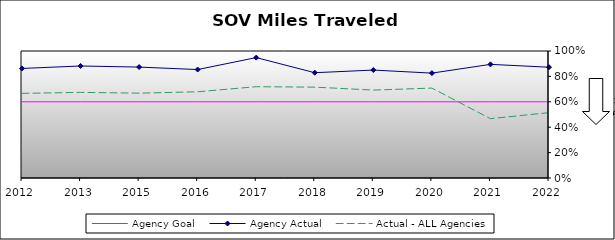
| Category | Agency Goal | Agency Actual | Actual - ALL Agencies |
|---|---|---|---|
| 2012.0 | 0.6 | 0.863 | 0.666 |
| 2013.0 | 0.6 | 0.882 | 0.674 |
| 2015.0 | 0.6 | 0.873 | 0.668 |
| 2016.0 | 0.6 | 0.854 | 0.679 |
| 2017.0 | 0.6 | 0.948 | 0.719 |
| 2018.0 | 0.6 | 0.829 | 0.715 |
| 2019.0 | 0.6 | 0.85 | 0.692 |
| 2020.0 | 0.6 | 0.826 | 0.708 |
| 2021.0 | 0.6 | 0.895 | 0.467 |
| 2022.0 | 0.6 | 0.872 | 0.515 |